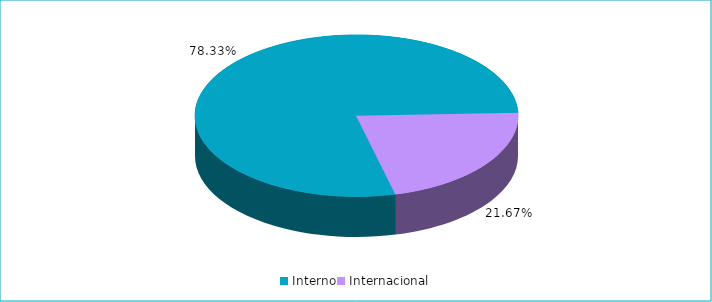
| Category | Series 0 |
|---|---|
| Interno | 0.783 |
| Internacional | 0.217 |